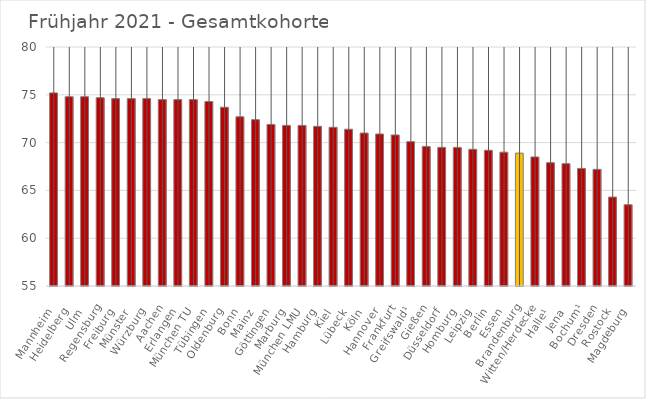
| Category | Mittelwert Ges |
|---|---|
| Mannheim | 75.2 |
| Heidelberg | 74.8 |
| Ulm | 74.8 |
| Regensburg | 74.7 |
| Freiburg | 74.6 |
| Münster | 74.6 |
| Würzburg | 74.6 |
| Aachen | 74.5 |
| Erlangen | 74.5 |
| München TU | 74.5 |
| Tübingen | 74.3 |
| Oldenburg | 73.7 |
| Bonn | 72.7 |
| Mainz | 72.4 |
| Göttingen | 71.9 |
| Marburg | 71.8 |
| München LMU | 71.8 |
| Hamburg | 71.7 |
| Kiel | 71.6 |
| Lübeck | 71.4 |
| Köln | 71 |
| Hannover | 70.9 |
| Frankfurt | 70.8 |
| Greifswald¹ | 70.1 |
| Gießen | 69.6 |
| Düsseldorf | 69.5 |
| Homburg | 69.5 |
| Leipzig | 69.3 |
| Berlin | 69.2 |
| Essen | 69 |
| Brandenburg | 68.9 |
| Witten/Herdecke | 68.5 |
| Halle¹ | 67.9 |
| Jena | 67.8 |
| Bochum¹ | 67.3 |
| Dresden | 67.2 |
| Rostock | 64.3 |
| Magdeburg | 63.5 |